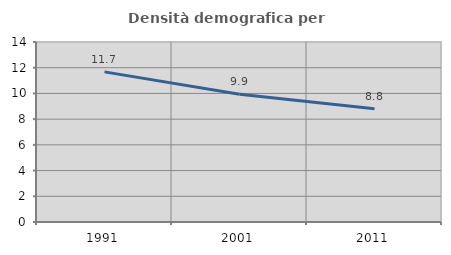
| Category | Densità demografica |
|---|---|
| 1991.0 | 11.677 |
| 2001.0 | 9.939 |
| 2011.0 | 8.802 |